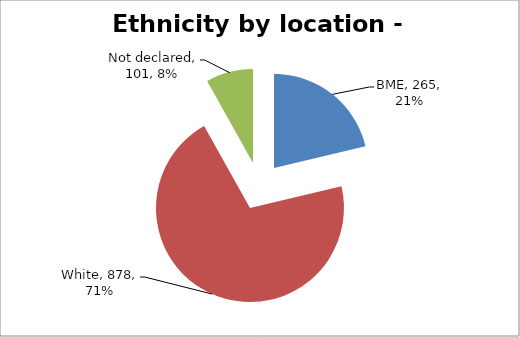
| Category | Series 0 |
|---|---|
| BME | 265 |
| White | 878 |
| Not declared | 101 |